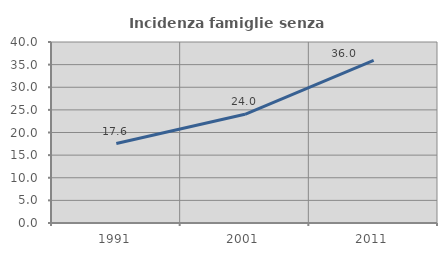
| Category | Incidenza famiglie senza nuclei |
|---|---|
| 1991.0 | 17.554 |
| 2001.0 | 24.019 |
| 2011.0 | 35.964 |